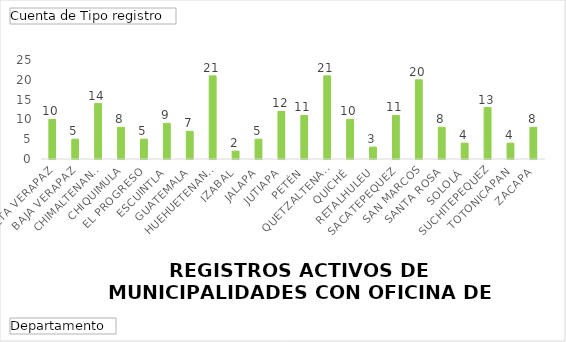
| Category | Total |
|---|---|
| ALTA VERAPAZ | 10 |
| BAJA VERAPAZ | 5 |
| CHIMALTENANGO | 14 |
| CHIQUIMULA | 8 |
| EL PROGRESO | 5 |
| ESCUINTLA | 9 |
| GUATEMALA | 7 |
| HUEHUETENANGO | 21 |
| IZABAL | 2 |
| JALAPA | 5 |
| JUTIAPA | 12 |
| PETÉN | 11 |
| QUETZALTENANGO | 21 |
| QUICHÉ | 10 |
| RETALHULEU | 3 |
| SACATEPEQUEZ | 11 |
| SAN MARCOS | 20 |
| SANTA ROSA | 8 |
| SOLOLÁ | 4 |
| SUCHITEPEQUEZ | 13 |
| TOTONICAPAN | 4 |
| ZACAPA | 8 |